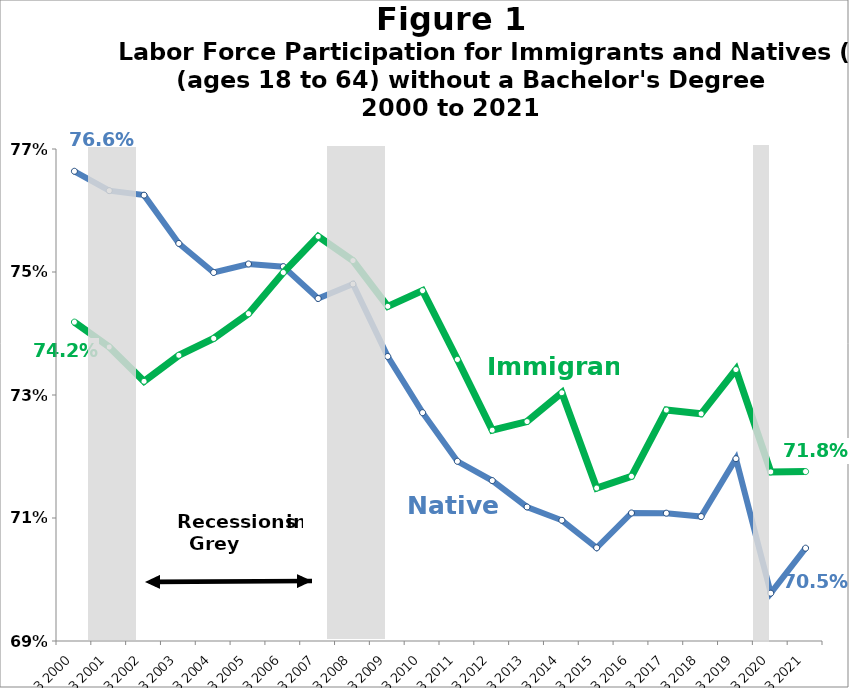
| Category | Native | Immigrant |
|---|---|---|
| Q3 2000 | 0.766 | 0.742 |
| Q3 2001 | 0.763 | 0.738 |
| Q3 2002 | 0.762 | 0.732 |
| Q3 2003 | 0.755 | 0.736 |
| Q3 2004 | 0.75 | 0.739 |
| Q3 2005 | 0.751 | 0.743 |
| Q3 2006 | 0.751 | 0.75 |
| Q3 2007 | 0.746 | 0.756 |
| Q3 2008 | 0.748 | 0.752 |
| Q3 2009 | 0.736 | 0.744 |
| Q3 2010 | 0.727 | 0.747 |
| Q3 2011 | 0.719 | 0.736 |
| Q3 2012 | 0.716 | 0.724 |
| Q3 2013 | 0.712 | 0.726 |
| Q3 2014 | 0.71 | 0.73 |
| Q3 2015 | 0.705 | 0.715 |
| Q3 2016 | 0.711 | 0.717 |
| Q3 2017 | 0.711 | 0.728 |
| Q3 2018 | 0.71 | 0.727 |
| Q3 2019 | 0.72 | 0.734 |
| Q3 2020 | 0.698 | 0.717 |
| Q3 2021 | 0.705 | 0.718 |